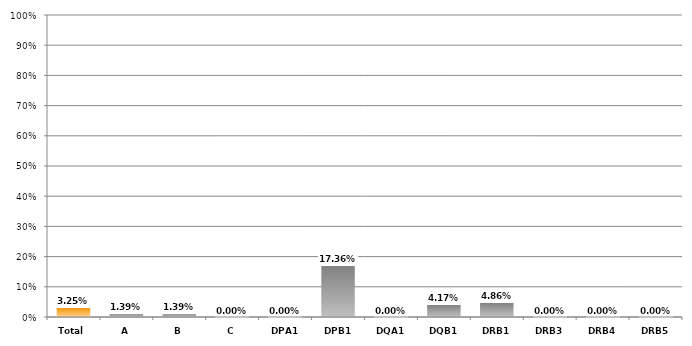
| Category | Series 0 |
|---|---|
| Total | 0.033 |
| A | 0.014 |
| B | 0.014 |
| C | 0 |
| DPA1 | 0 |
| DPB1 | 0.174 |
| DQA1 | 0 |
| DQB1 | 0.042 |
| DRB1 | 0.049 |
| DRB3 | 0 |
| DRB4 | 0 |
| DRB5 | 0 |